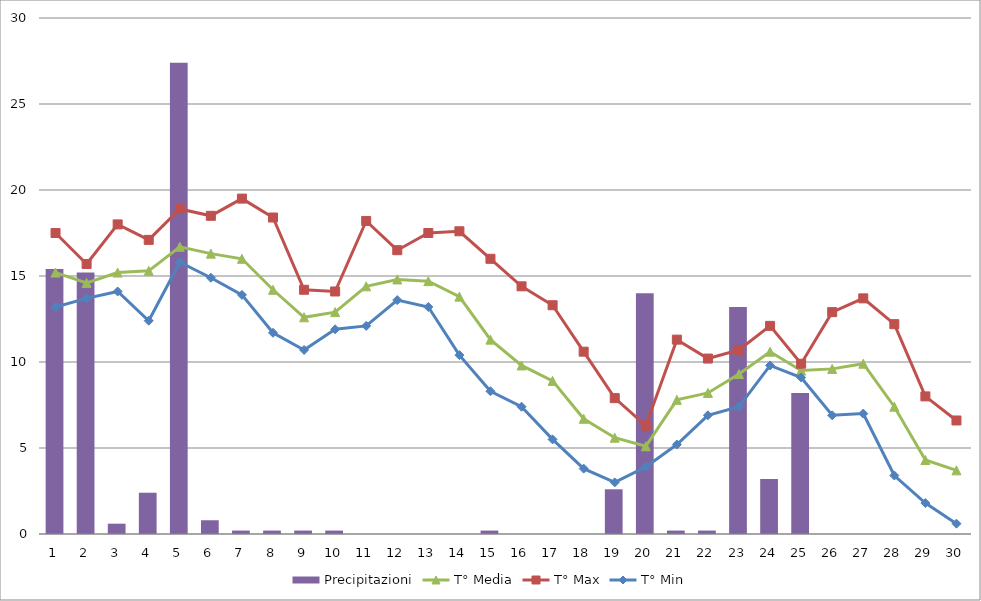
| Category | Precipitazioni |
|---|---|
| 0 | 15.4 |
| 1 | 15.2 |
| 2 | 0.6 |
| 3 | 2.4 |
| 4 | 27.4 |
| 5 | 0.8 |
| 6 | 0.2 |
| 7 | 0.2 |
| 8 | 0.2 |
| 9 | 0.2 |
| 10 | 0 |
| 11 | 0 |
| 12 | 0 |
| 13 | 0 |
| 14 | 0.2 |
| 15 | 0 |
| 16 | 0 |
| 17 | 0 |
| 18 | 2.6 |
| 19 | 14 |
| 20 | 0.2 |
| 21 | 0.2 |
| 22 | 13.2 |
| 23 | 3.2 |
| 24 | 8.2 |
| 25 | 0 |
| 26 | 0 |
| 27 | 0 |
| 28 | 0 |
| 29 | 0 |